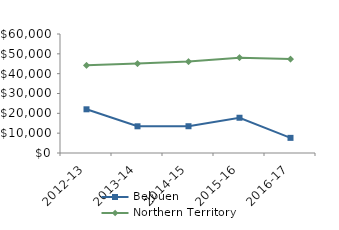
| Category | Belyuen | Northern Territory |
|---|---|---|
| 2012-13 | 22033 | 44232.02 |
| 2013-14 | 13464.92 | 45075.51 |
| 2014-15 | 13500 | 46083.65 |
| 2015-16 | 17774.49 | 48046.27 |
| 2016-17 | 7635.97 | 47367.05 |